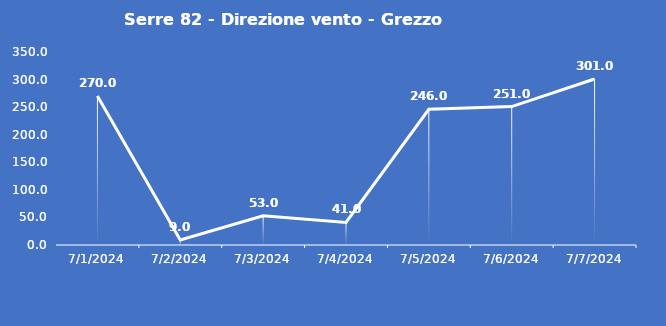
| Category | Serre 82 - Direzione vento - Grezzo (°N) |
|---|---|
| 7/1/24 | 270 |
| 7/2/24 | 9 |
| 7/3/24 | 53 |
| 7/4/24 | 41 |
| 7/5/24 | 246 |
| 7/6/24 | 251 |
| 7/7/24 | 301 |